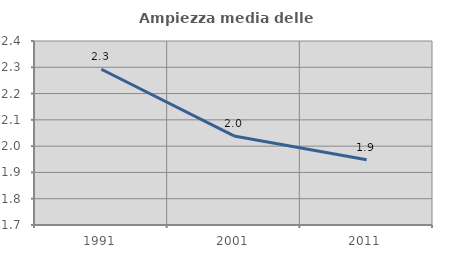
| Category | Ampiezza media delle famiglie |
|---|---|
| 1991.0 | 2.293 |
| 2001.0 | 2.039 |
| 2011.0 | 1.948 |